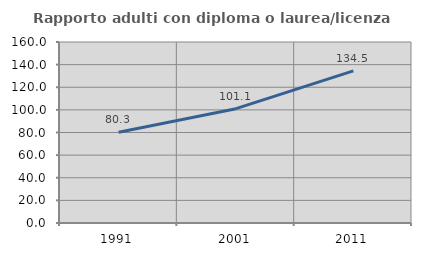
| Category | Rapporto adulti con diploma o laurea/licenza media  |
|---|---|
| 1991.0 | 80.282 |
| 2001.0 | 101.053 |
| 2011.0 | 134.483 |